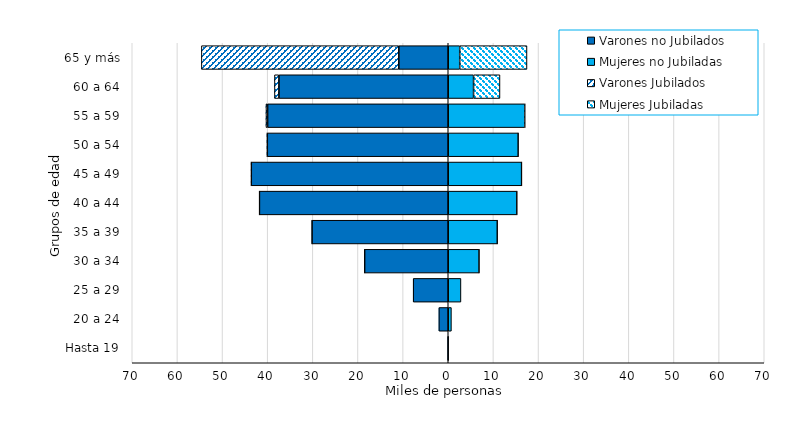
| Category | Varones no Jubilados | Mujeres no Jubiladas | Varones Jubilados | Mujeres Jubiladas |
|---|---|---|---|---|
| Hasta 19 | -104 | 43 | 0 | 0 |
| 20 a 24 | -2072 | 702 | 0 | 0 |
| 25 a 29 | -7765 | 2811 | 0 | 0 |
| 30 a 34 | -18530 | 6849 | -3 | 1 |
| 35 a 39 | -30187 | 10878 | -8 | 2 |
| 40 a 44 | -41828 | 15215 | -15 | 4 |
| 45 a 49 | -43629 | 16257 | -38 | 9 |
| 50 a 54 | -40083 | 15509 | -82 | 17 |
| 55 a 59 | -40011 | 16951 | -371 | 92 |
| 60 a 64 | -37512 | 5606 | -984 | 5852 |
| 65 y más | -10951 | 2544 | -43732 | 14894 |